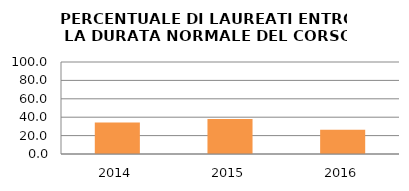
| Category | 2014 2015 2016 |
|---|---|
| 2014.0 | 34.286 |
| 2015.0 | 38.095 |
| 2016.0 | 26.471 |